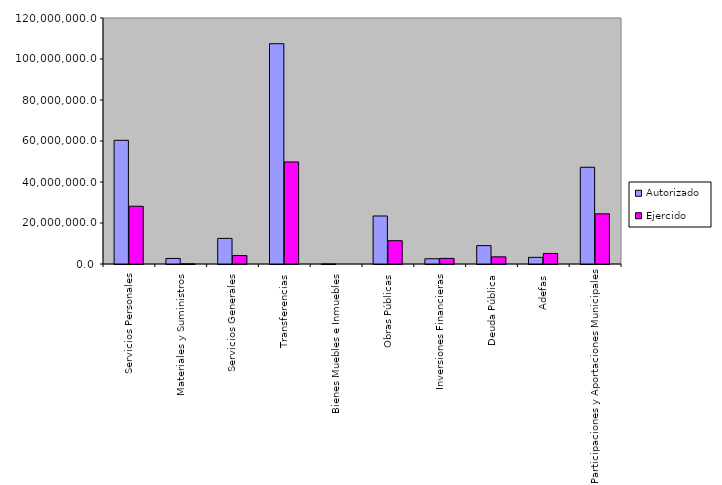
| Category | Autorizado | Ejercido |
|---|---|---|
| 0 | 60341463.1 | 28172457.9 |
| 1 | 2710247.7 | 73976.2 |
| 2 | 12499675.9 | 4117842.2 |
| 3 | 107454281.3 | 49794280.6 |
| 4 | 4331.4 | 0 |
| 5 | 23420419.6 | 11360953.3 |
| 6 | 2560133.5 | 2736290.7 |
| 7 | 8965665.2 | 3492717.5 |
| 8 | 3243691 | 5123271.8 |
| 9 | 47198300.6 | 24478195.3 |